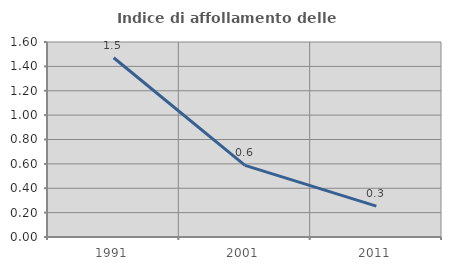
| Category | Indice di affollamento delle abitazioni  |
|---|---|
| 1991.0 | 1.471 |
| 2001.0 | 0.588 |
| 2011.0 | 0.254 |